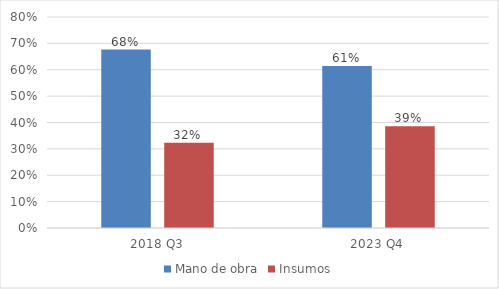
| Category | Mano de obra | Insumos |
|---|---|---|
| 2018 Q3 | 0.676 | 0.324 |
| 2023 Q4 | 0.614 | 0.386 |